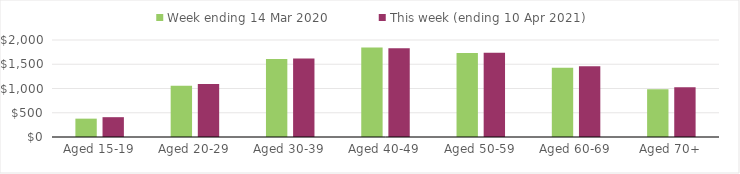
| Category | Week ending 14 Mar 2020 | This week (ending 10 Apr 2021) |
|---|---|---|
| Aged 15-19 | 378.32 | 408.72 |
| Aged 20-29 | 1055.59 | 1090.95 |
| Aged 30-39 | 1610.47 | 1619.74 |
| Aged 40-49 | 1846.75 | 1832.28 |
| Aged 50-59 | 1732.54 | 1736.37 |
| Aged 60-69 | 1428.79 | 1457.07 |
| Aged 70+ | 983.14 | 1024.48 |